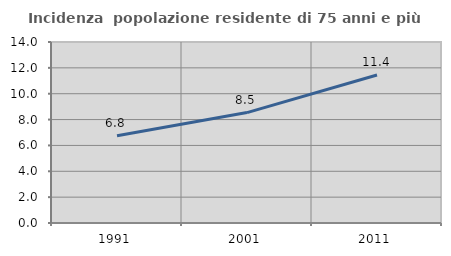
| Category | Incidenza  popolazione residente di 75 anni e più |
|---|---|
| 1991.0 | 6.754 |
| 2001.0 | 8.541 |
| 2011.0 | 11.446 |